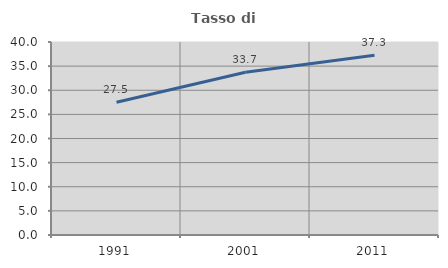
| Category | Tasso di occupazione   |
|---|---|
| 1991.0 | 27.5 |
| 2001.0 | 33.741 |
| 2011.0 | 37.255 |